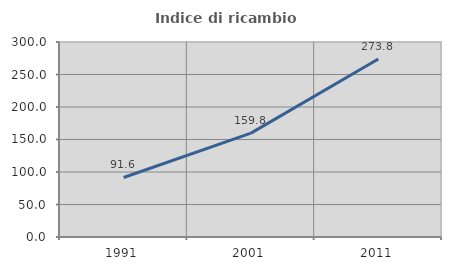
| Category | Indice di ricambio occupazionale  |
|---|---|
| 1991.0 | 91.571 |
| 2001.0 | 159.794 |
| 2011.0 | 273.759 |